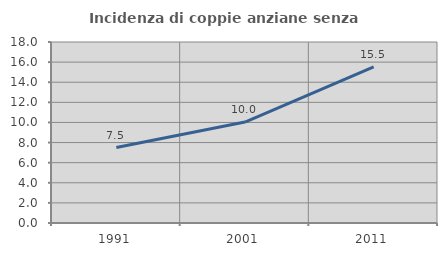
| Category | Incidenza di coppie anziane senza figli  |
|---|---|
| 1991.0 | 7.5 |
| 2001.0 | 10.039 |
| 2011.0 | 15.528 |